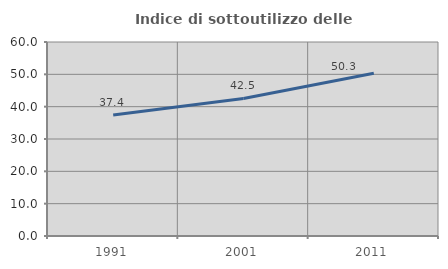
| Category | Indice di sottoutilizzo delle abitazioni  |
|---|---|
| 1991.0 | 37.398 |
| 2001.0 | 42.537 |
| 2011.0 | 50.318 |